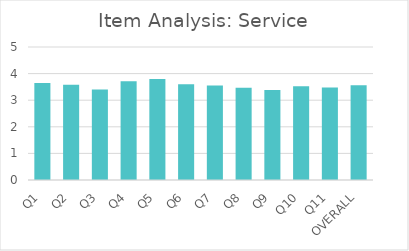
| Category | Series 0 |
|---|---|
| Q1 | 3.65 |
| Q2 | 3.58 |
| Q3 | 3.4 |
| Q4 | 3.71 |
| Q5 | 3.8 |
| Q6 | 3.6 |
| Q7 | 3.55 |
| Q8 | 3.47 |
| Q9 | 3.38 |
| Q10 | 3.52 |
| Q11 | 3.48 |
| OVERALL | 3.56 |